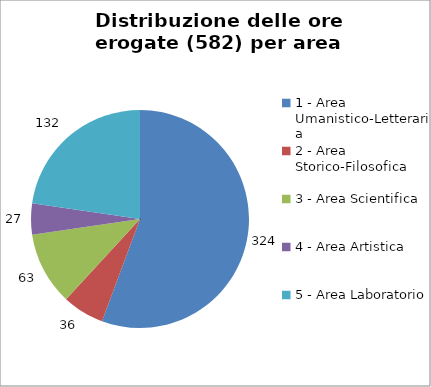
| Category | Nr. Ore Erogate |
|---|---|
| 1 - Area Umanistico-Letteraria | 324 |
| 2 - Area Storico-Filosofica | 36 |
| 3 - Area Scientifica | 63 |
| 4 - Area Artistica | 27 |
| 5 - Area Laboratorio | 132 |